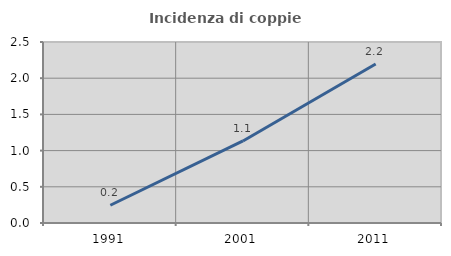
| Category | Incidenza di coppie miste |
|---|---|
| 1991.0 | 0.245 |
| 2001.0 | 1.133 |
| 2011.0 | 2.196 |